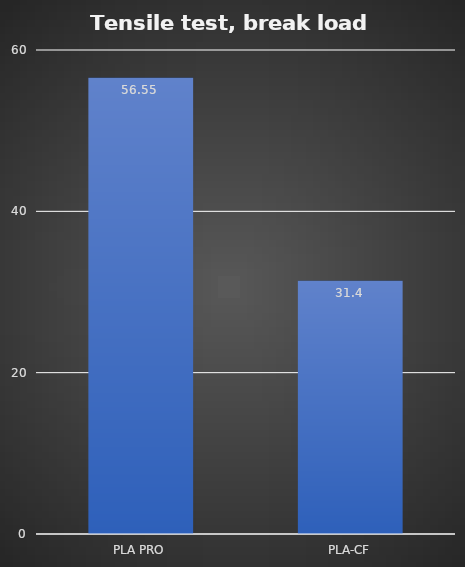
| Category | Average (kg) |
|---|---|
| PLA PRO | 56.55 |
| PLA-CF | 31.4 |